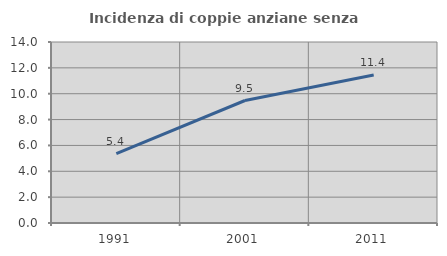
| Category | Incidenza di coppie anziane senza figli  |
|---|---|
| 1991.0 | 5.372 |
| 2001.0 | 9.475 |
| 2011.0 | 11.445 |